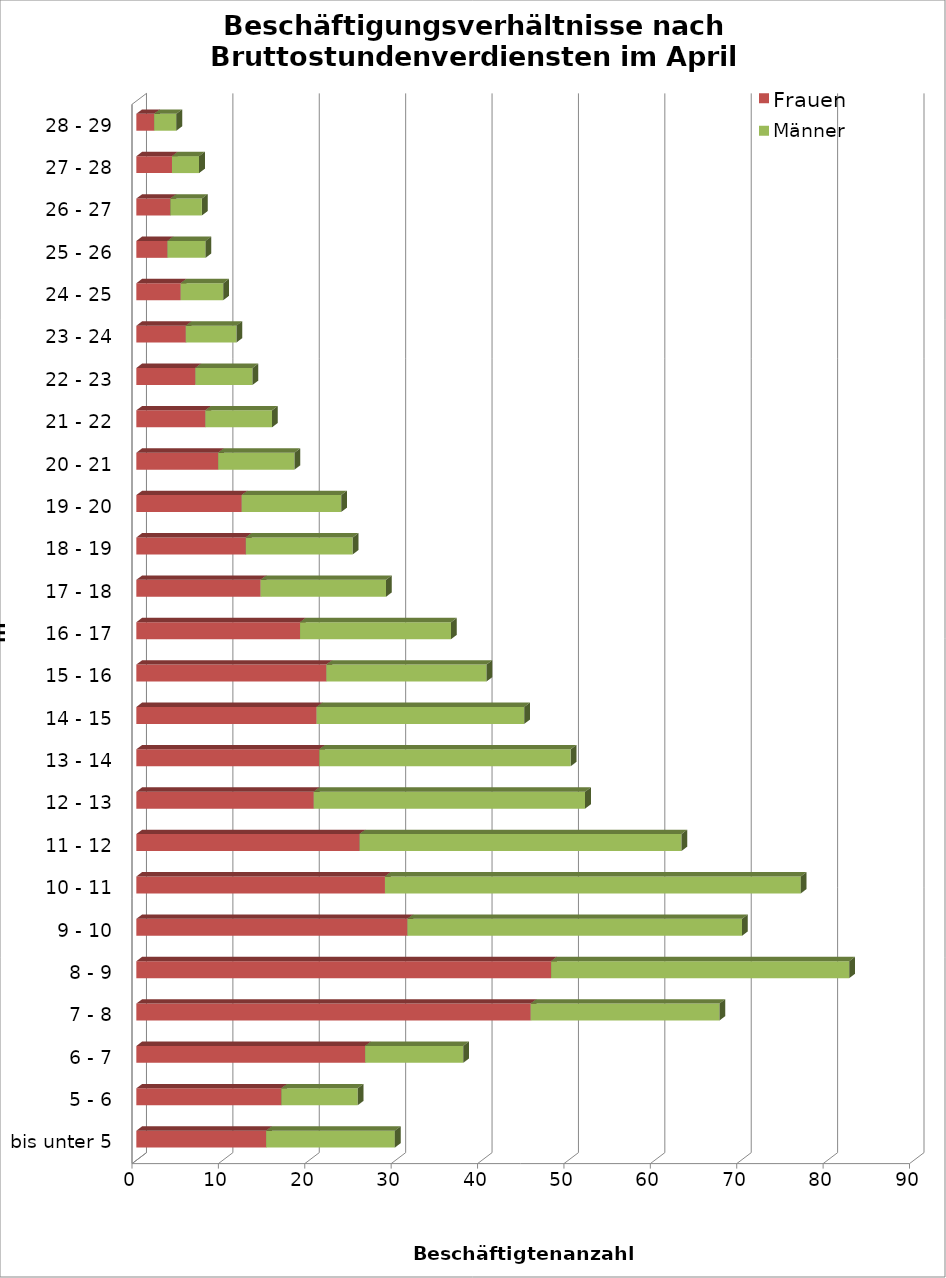
| Category | Frauen | Männer |
|---|---|---|
| bis unter 5 | 15.023 | 14.898 |
| 5 - 6 | 16.782 | 8.841 |
| 6 - 7 | 26.485 | 11.347 |
| 7 - 8 | 45.65 | 21.85 |
| 8 - 9 | 48.008 | 34.517 |
| 9 - 10 | 31.383 | 38.733 |
| 10 - 11 | 28.779 | 48.135 |
| 11 - 12 | 25.843 | 37.258 |
| 12 - 13 | 20.537 | 31.407 |
| 13 - 14 | 21.177 | 29.093 |
| 14 - 15 | 20.868 | 24.034 |
| 15 - 16 | 21.999 | 18.529 |
| 16 - 17 | 18.949 | 17.481 |
| 17 - 18 | 14.386 | 14.513 |
| 18 - 19 | 12.677 | 12.365 |
| 19 - 20 | 12.201 | 11.503 |
| 20 - 21 | 9.472 | 8.829 |
| 21 - 22 | 7.993 | 7.717 |
| 22 - 23 | 6.839 | 6.609 |
| 23 - 24 | 5.726 | 5.853 |
| 24 - 25 | 5.137 | 4.921 |
| 25 - 26 | 3.605 | 4.405 |
| 26 - 27 | 3.938 | 3.649 |
| 27 - 28 | 4.126 | 3.137 |
| 28 - 29 | 2.063 | 2.568 |